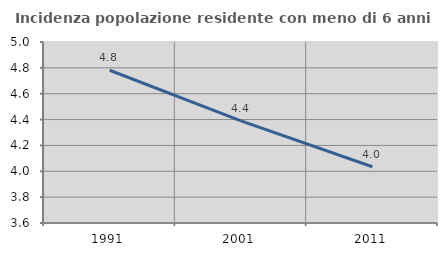
| Category | Incidenza popolazione residente con meno di 6 anni |
|---|---|
| 1991.0 | 4.782 |
| 2001.0 | 4.39 |
| 2011.0 | 4.035 |